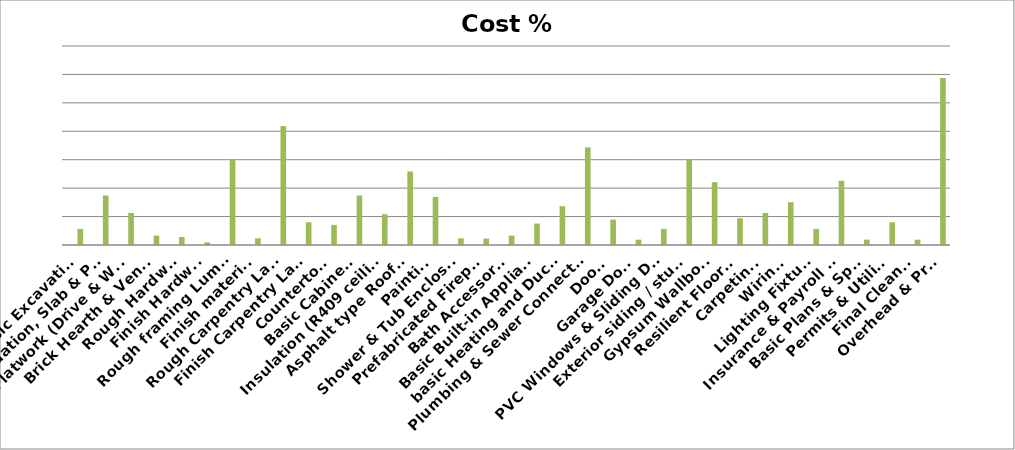
| Category | Series 0 | Series 1 | Series 2 |
|---|---|---|---|
| Basic Excavation | 0.012 | 2.82 | 5640 |
| Foundation, Slab & Piers | 0.037 | 8.71 | 17420 |
| Flatwork (Drive & Walk) | 0.024 | 5.64 | 11280 |
| Brick Hearth & Veneer | 0.007 | 1.65 | 3300 |
| Rough Hardware | 0.006 | 1.41 | 2820 |
| Finish Hardware | 0.002 | 0.47 | 940 |
| Rough framing Lumber | 0.064 | 15.04 | 30080 |
| Finish materials | 0.005 | 1.18 | 2360 |
| Rough Carpentry Labor | 0.089 | 20.92 | 41840 |
| Finish Carpentry Labor | 0.017 | 4 | 8000 |
| Countertops | 0.015 | 3.53 | 7060 |
| Basic Cabinets  | 0.037 | 8.7 | 17400 |
| Insulation (R409 ceiling)  | 0.023 | 5.41 | 10820 |
| Asphalt type Roofing  | 0.055 | 12.93 | 25860 |
| Painting | 0.036 | 8.46 | 16920 |
| Shower & Tub Enclosure | 0.005 | 1.18 | 2360 |
| Prefabricated Fireplace | 0.009 | 1.12 | 2240 |
| Bath Accessories | 0.007 | 1.65 | 3300 |
| Basic Built-in Appliances | 0.016 | 3.76 | 7520 |
| basic Heating and Ducting | 0.029 | 6.82 | 13640 |
| Plumbing & Sewer Connections  | 0.073 | 17.16 | 34320 |
| Doors | 0.019 | 4.47 | 8940 |
| Garage Door | 0.004 | 0.94 | 1880 |
| PVC Windows & Sliding Doors | 0.012 | 2.82 | 5640 |
| Exterior siding / stucco | 0.064 | 15.04 | 30080 |
| Gypsum Wallboard | 0.047 | 11.05 | 22100 |
| Resilient Flooring | 0.02 | 4.7 | 9400 |
| Carpeting  | 0.024 | 5.64 | 11280 |
| Wiring  | 0.032 | 7.52 | 15040 |
| Lighting Fixtures | 0.012 | 2.82 | 5640 |
| Insurance & Payroll Tax | 0.048 | 11.28 | 22560 |
| Basic Plans & Specs | 0.004 | 0.94 | 1880 |
| Permits & Utilities | 0.017 | 4 | 8000 |
| Final Cleanup | 0.004 | 0.94 | 1880 |
| Overhead & Profit | 0.125 | 29.38 | 58760 |